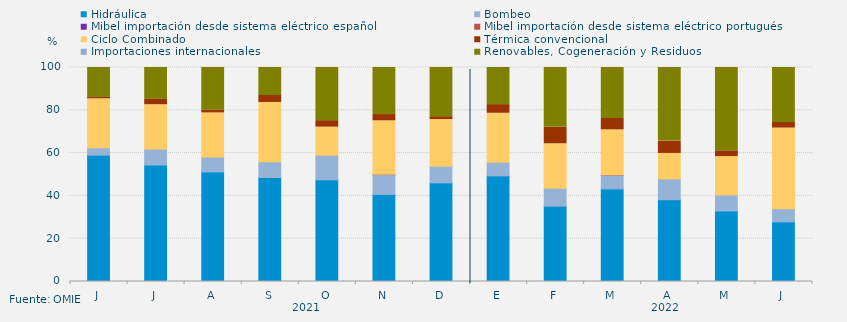
| Category | Hidráulica | Bombeo | Mibel importación desde sistema eléctrico español | Mibel importación desde sistema eléctrico portugués | Ciclo Combinado | Térmica convencional | Importaciones internacionales | Renovables, Cogeneración y Residuos |
|---|---|---|---|---|---|---|---|---|
| J | 59.051 | 3.472 | 0 | 0 | 22.847 | 0.625 | 0 | 14.005 |
| J | 54.424 | 7.471 | 0 | 0 | 20.71 | 2.487 | 0 | 14.908 |
| A | 51.211 | 6.931 | 0 | 0 | 20.659 | 1.279 | 0 | 19.919 |
| S | 48.586 | 7.395 | 0 | 0 | 27.677 | 3.245 | 0 | 13.097 |
| O | 47.516 | 11.526 | 0 | 0 | 13.093 | 3.021 | 0 | 24.843 |
| N | 40.671 | 9.282 | 0 | 0.139 | 25 | 2.917 | 0 | 21.991 |
| D | 46.102 | 7.728 | 0 | 0 | 21.841 | 1.344 | 0 | 22.984 |
| E | 49.362 | 6.328 | 0 | 0 | 22.928 | 4.032 | 0 | 17.35 |
| F | 35.193 | 8.333 | 0 | 0 | 20.833 | 7.664 | 0 | 27.976 |
| M | 43.282 | 6.472 | 0 | 0.135 | 20.962 | 5.328 | 0 | 23.822 |
| A | 38.224 | 9.736 | 0 | 0 | 11.892 | 5.749 | 0 | 34.4 |
| M | 32.929 | 7.525 | 0 | 0 | 17.925 | 2.695 | 0 | 38.926 |
| J | 27.87 | 6.134 | 0 | 0 | 37.708 | 2.569 | 0 | 25.718 |